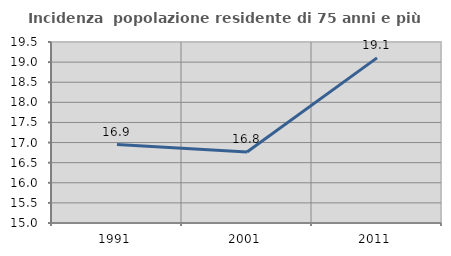
| Category | Incidenza  popolazione residente di 75 anni e più |
|---|---|
| 1991.0 | 16.949 |
| 2001.0 | 16.763 |
| 2011.0 | 19.105 |